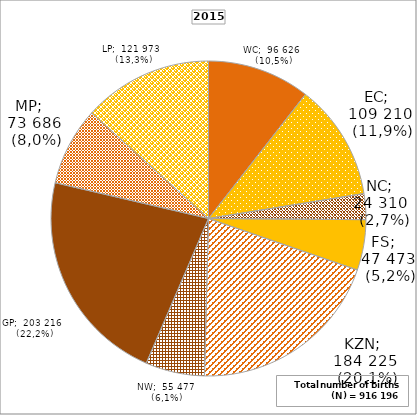
| Category | Series 0 | Series 1 |
|---|---|---|
| WC | 96626 | 10.546 |
| EC | 109210 | 11.92 |
| NC | 24310 | 2.653 |
| FS | 47473 | 5.182 |
| KZN | 184225 | 20.108 |
| NW | 55477 | 6.055 |
| GP | 203216 | 22.18 |
| MP | 73686 | 8.043 |
| LP | 121973 | 13.313 |